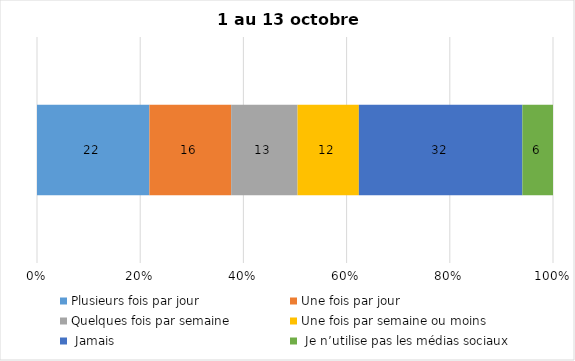
| Category | Plusieurs fois par jour | Une fois par jour | Quelques fois par semaine   | Une fois par semaine ou moins   |  Jamais   |  Je n’utilise pas les médias sociaux |
|---|---|---|---|---|---|---|
| 0 | 22 | 16 | 13 | 12 | 32 | 6 |